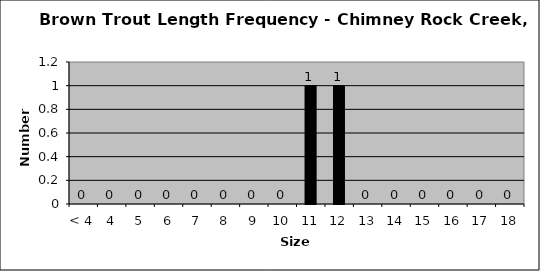
| Category | Series 0 |
|---|---|
| < 4 | 0 |
| 4 | 0 |
| 5 | 0 |
| 6 | 0 |
| 7 | 0 |
| 8 | 0 |
| 9 | 0 |
| 10 | 0 |
| 11 | 1 |
| 12 | 1 |
| 13 | 0 |
| 14 | 0 |
| 15 | 0 |
| 16 | 0 |
| 17 | 0 |
| 18 | 0 |